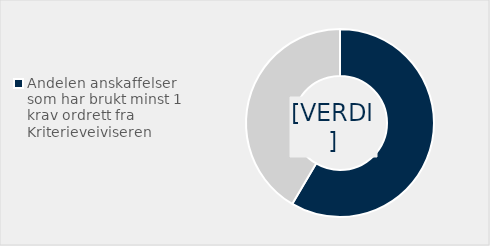
| Category | Series 0 |
|---|---|
| Andelen anskaffelser som har brukt minst 1 krav ordrett fra Kriterieveiviseren | 0.544 |
| Ikke brukt krtierieveiviseren | 0.386 |